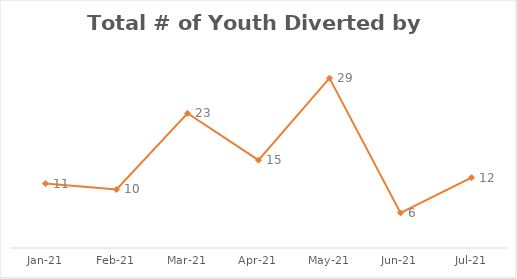
| Category | Series 0 |
|---|---|
| 2021-01-01 | 11 |
| 2021-02-01 | 10 |
| 2021-03-01 | 23 |
| 2021-04-01 | 15 |
| 2021-05-01 | 29 |
| 2021-06-01 | 6 |
| 2021-07-01 | 12 |